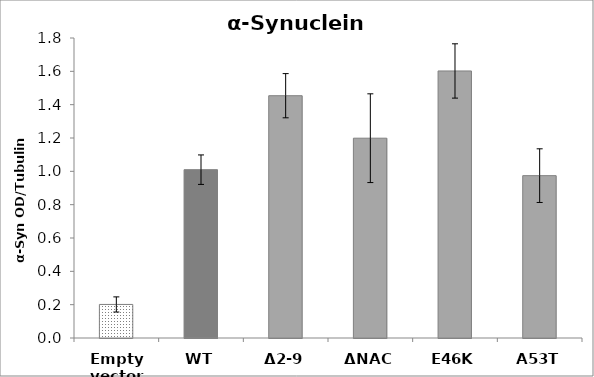
| Category | Series 0 |
|---|---|
| Empty vector | 0.201 |
| WT | 1.01 |
| Δ2-9 | 1.454 |
| ΔNAC | 1.199 |
| E46K | 1.602 |
| A53T | 0.974 |